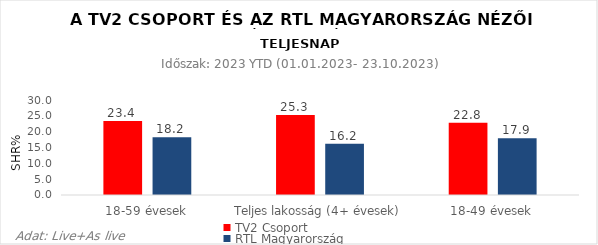
| Category | TV2 Csoport | RTL Magyarország |
|---|---|---|
| 18-59 évesek | 23.4 | 18.2 |
| Teljes lakosság (4+ évesek) | 25.3 | 16.2 |
| 18-49 évesek | 22.8 | 17.9 |